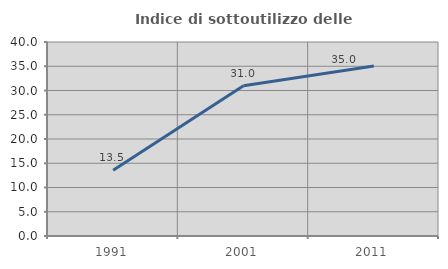
| Category | Indice di sottoutilizzo delle abitazioni  |
|---|---|
| 1991.0 | 13.545 |
| 2001.0 | 30.989 |
| 2011.0 | 35.048 |